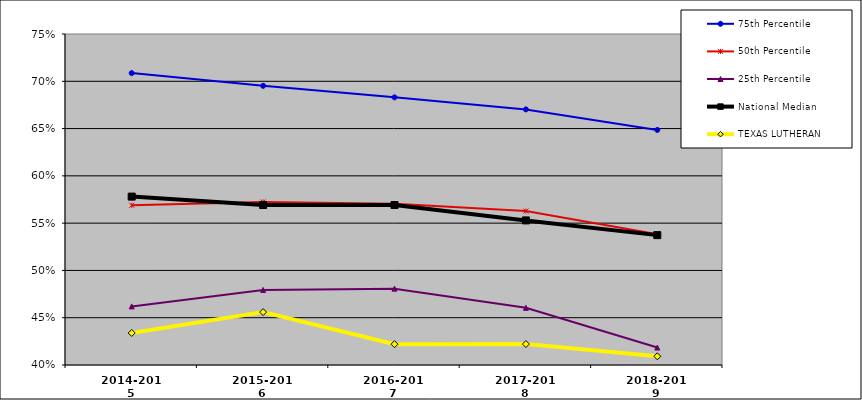
| Category | 75th Percentile | 50th Percentile | 25th Percentile | National Median | TEXAS LUTHERAN |
|---|---|---|---|---|---|
| 2014-2015 | 0.709 | 0.569 | 0.462 | 0.578 | 0.434 |
| 2015-2016 | 0.695 | 0.572 | 0.479 | 0.569 | 0.456 |
| 2016-2017 | 0.683 | 0.57 | 0.481 | 0.569 | 0.422 |
| 2017-2018 | 0.67 | 0.563 | 0.46 | 0.553 | 0.422 |
| 2018-2019 | 0.649 | 0.538 | 0.418 | 0.537 | 0.409 |